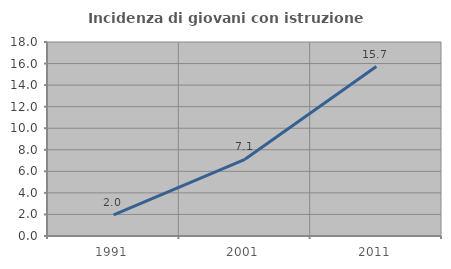
| Category | Incidenza di giovani con istruzione universitaria |
|---|---|
| 1991.0 | 1.967 |
| 2001.0 | 7.12 |
| 2011.0 | 15.726 |